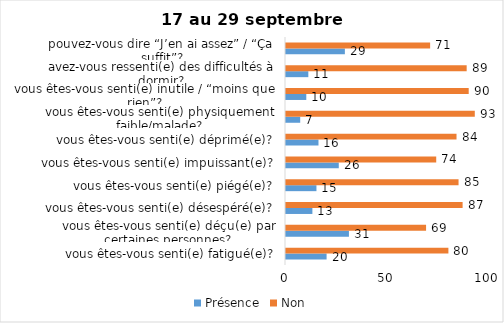
| Category | Présence | Non |
|---|---|---|
| vous êtes-vous senti(e) fatigué(e)? | 20 | 80 |
| vous êtes-vous senti(e) déçu(e) par certaines personnes? | 31 | 69 |
| vous êtes-vous senti(e) désespéré(e)? | 13 | 87 |
| vous êtes-vous senti(e) piégé(e)? | 15 | 85 |
| vous êtes-vous senti(e) impuissant(e)? | 26 | 74 |
| vous êtes-vous senti(e) déprimé(e)? | 16 | 84 |
| vous êtes-vous senti(e) physiquement faible/malade? | 7 | 93 |
| vous êtes-vous senti(e) inutile / “moins que rien”? | 10 | 90 |
| avez-vous ressenti(e) des difficultés à dormir? | 11 | 89 |
| pouvez-vous dire “J’en ai assez” / “Ça suffit”? | 29 | 71 |